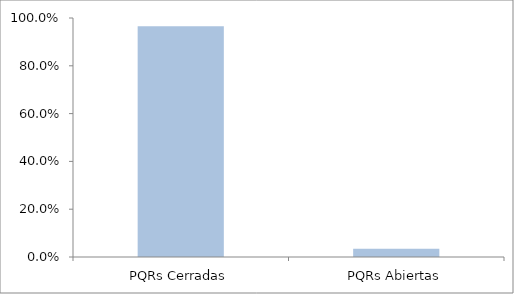
| Category | Series 0 |
|---|---|
| PQRs Cerradas | 0.965 |
| PQRs Abiertas | 0.035 |